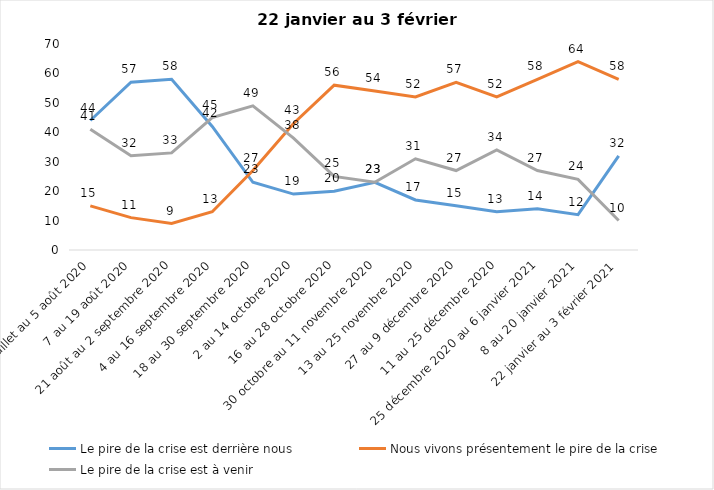
| Category | Le pire de la crise est derrière nous | Nous vivons présentement le pire de la crise | Le pire de la crise est à venir |
|---|---|---|---|
| 24 juillet au 5 août 2020 | 44 | 15 | 41 |
| 7 au 19 août 2020 | 57 | 11 | 32 |
| 21 août au 2 septembre 2020 | 58 | 9 | 33 |
| 4 au 16 septembre 2020 | 42 | 13 | 45 |
| 18 au 30 septembre 2020 | 23 | 27 | 49 |
| 2 au 14 octobre 2020 | 19 | 43 | 38 |
| 16 au 28 octobre 2020 | 20 | 56 | 25 |
| 30 octobre au 11 novembre 2020 | 23 | 54 | 23 |
| 13 au 25 novembre 2020 | 17 | 52 | 31 |
| 27 au 9 décembre 2020 | 15 | 57 | 27 |
| 11 au 25 décembre 2020 | 13 | 52 | 34 |
| 25 décembre 2020 au 6 janvier 2021 | 14 | 58 | 27 |
| 8 au 20 janvier 2021 | 12 | 64 | 24 |
| 22 janvier au 3 février 2021 | 32 | 58 | 10 |